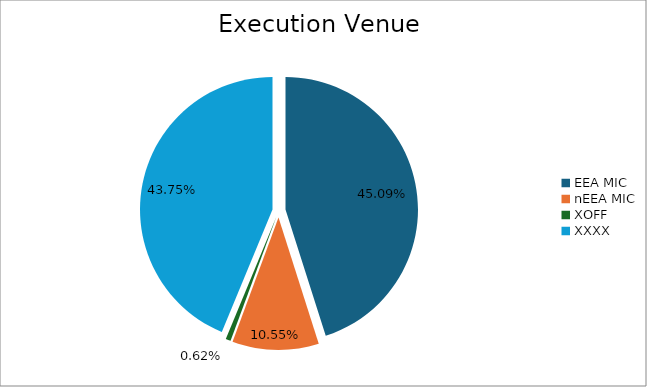
| Category | Series 0 |
|---|---|
| EEA MIC | 5755559.374 |
| nEEA MIC | 1346061.97 |
| XOFF | 78832.893 |
| XXXX | 5584411.879 |